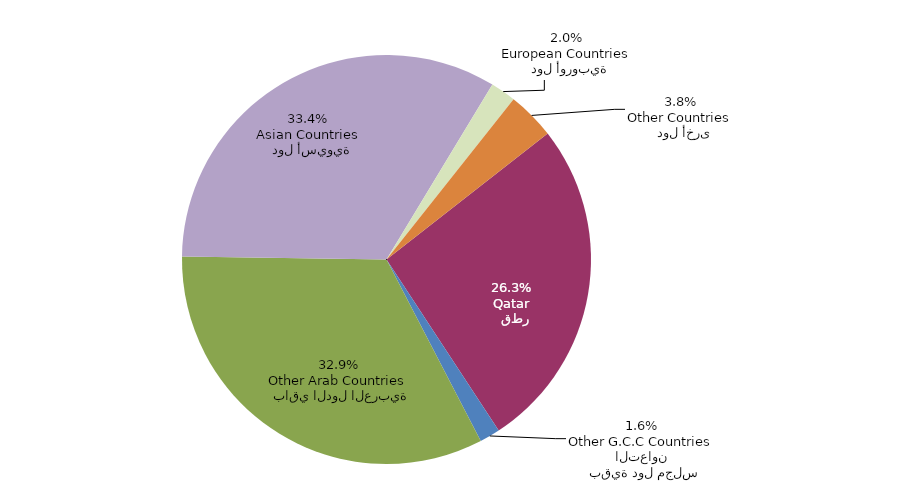
| Category | Series 0 |
|---|---|
|   قطر
Qatar | 1611 |
|   بقية دول مجلس التعاون
Other G.C.C Countries | 99 |
|   باقي الدول العربية
Other Arab Countries | 2011 |
|   دول أسيوية
Asian Countries | 2047 |
|   دول أوروبية
European Countries | 123 |
|   دول أخرى
Other Countries | 231 |